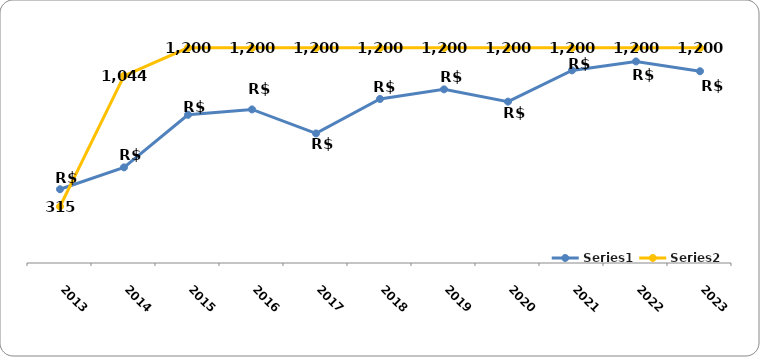
| Category | Series 0 | Series 1 |
|---|---|---|
| 2013.0 | 411.21 | 315 |
| 2014.0 | 533.32 | 1044 |
| 2015.0 | 826.52 | 1200 |
| 2016.0 | 856.6 | 1200 |
| 2017.0 | 722.66 | 1200 |
| 2018.0 | 914.97 | 1200 |
| 2019.0 | 968.42 | 1200 |
| 2020.0 | 900.22 | 1200 |
| 2021.0 | 1074.28 | 1200 |
| 2022.0 | 1124.2 | 1200 |
| 2023.0 | 1069.5 | 1200 |